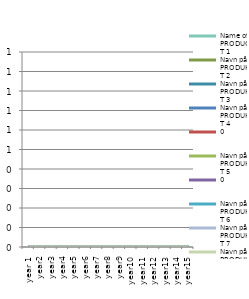
| Category | Name of PRODUCT 1 | Navn på PRODUKT 2 | Navn på PRODUKT 3 | Navn på PRODUKT 4 | 0 | Navn på PRODUKT 5 | Navn på PRODUKT 6 | Navn på PRODUKT 7 | Navn på PRODUKT 8 |
|---|---|---|---|---|---|---|---|---|---|
| year 1 | 0 | 0 | 0 | 0 | 0 | 0 | 0 | 0 | 0 |
| year2 | 0 | 0 | 0 | 0 | 0 | 0 | 0 | 0 | 0 |
| year3 | 0 | 0 | 0 | 0 | 0 | 0 | 0 | 0 | 0 |
| year4 | 0 | 0 | 0 | 0 | 0 | 0 | 0 | 0 | 0 |
| year5 | 0 | 0 | 0 | 0 | 0 | 0 | 0 | 0 | 0 |
| year6 | 0 | 0 | 0 | 0 | 0 | 0 | 0 | 0 | 0 |
| year7 | 0 | 0 | 0 | 0 | 0 | 0 | 0 | 0 | 0 |
| year8 | 0 | 0 | 0 | 0 | 0 | 0 | 0 | 0 | 0 |
| year9 | 0 | 0 | 0 | 0 | 0 | 0 | 0 | 0 | 0 |
| year10 | 0 | 0 | 0 | 0 | 0 | 0 | 0 | 0 | 0 |
| year11 | 0 | 0 | 0 | 0 | 0 | 0 | 0 | 0 | 0 |
| year12 | 0 | 0 | 0 | 0 | 0 | 0 | 0 | 0 | 0 |
| year13 | 0 | 0 | 0 | 0 | 0 | 0 | 0 | 0 | 0 |
| year14 | 0 | 0 | 0 | 0 | 0 | 0 | 0 | 0 | 0 |
| year15 | 0 | 0 | 0 | 0 | 0 | 0 | 0 | 0 | 0 |